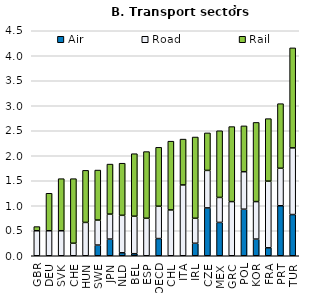
| Category | Air | Road | Rail |
|---|---|---|---|
| GBR | 0 | 0.5 | 0.083 |
| DEU | 0 | 0.5 | 0.75 |
| SVK | 0 | 0.5 | 1.042 |
| CHE | 0 | 0.25 | 1.292 |
| HUN | 0 | 0.667 | 1.042 |
| SWE | 0.214 | 0.5 | 1 |
| JPN | 0.333 | 0.5 | 1 |
| NLD | 0.059 | 0.75 | 1.042 |
| BEL | 0.041 | 0.75 | 1.25 |
| ESP | 0 | 0.75 | 1.333 |
| OECD | 0.344 | 0.647 | 1.178 |
| CHL | 0 | 0.917 | 1.375 |
| ITA | 0 | 1.417 | 0.917 |
| IRL | 0.25 | 0.5 | 1.625 |
| CZE | 0.957 | 0.75 | 0.75 |
| MEX | 0.667 | 0.5 | 1.333 |
| GRC | 0 | 1.083 | 1.5 |
| POL | 0.931 | 0.75 | 0.917 |
| KOR | 0.333 | 0.75 | 1.583 |
| FRA | 0.159 | 1.333 | 1.25 |
| PRT | 1 | 0.75 | 1.292 |
| TUR | 0.824 | 1.333 | 2 |